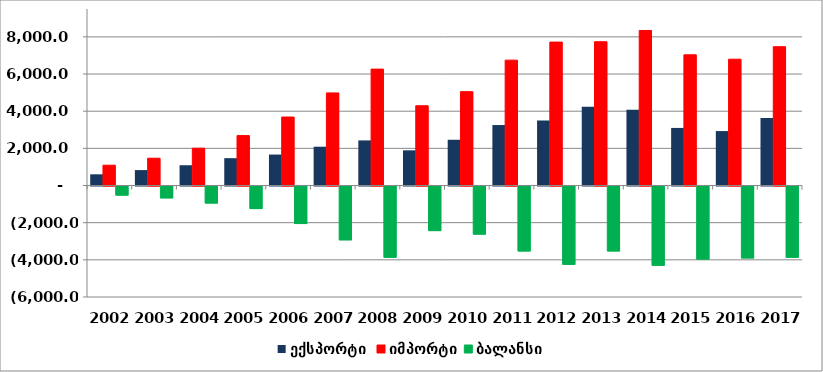
| Category | ექსპორტი  | იმპორტი | ბალანსი |
|---|---|---|---|
| 2002.0 | 603.334 | 1092.525 | -489.191 |
| 2003.0 | 830.555 | 1469.169 | -638.614 |
| 2004.0 | 1092.111 | 2007.734 | -915.622 |
| 2005.0 | 1472.437 | 2686.341 | -1213.903 |
| 2006.0 | 1666.526 | 3685.88 | -2019.354 |
| 2007.0 | 2088.285 | 4984.11 | -2895.825 |
| 2008.0 | 2427.979 | 6264.175 | -3836.196 |
| 2009.0 | 1893.602 | 4293.454 | -2399.852 |
| 2010.0 | 2462.202 | 5052.275 | -2590.074 |
| 2011.0 | 3254.492 | 6748.31 | -3493.818 |
| 2012.0 | 3502.319 | 7718.323 | -4216.003 |
| 2013.0 | 4245.762 | 7738.396 | -3492.634 |
| 2014.0 | 4073.324 | 8344.283 | -4270.958 |
| 2015.0 | 3099.467 | 7033.992 | -3934.525 |
| 2016.0 | 2930.68 | 6799.861 | -3869.181 |
| 2017.0 | 3633.894 | 7470.689 | -3836.796 |